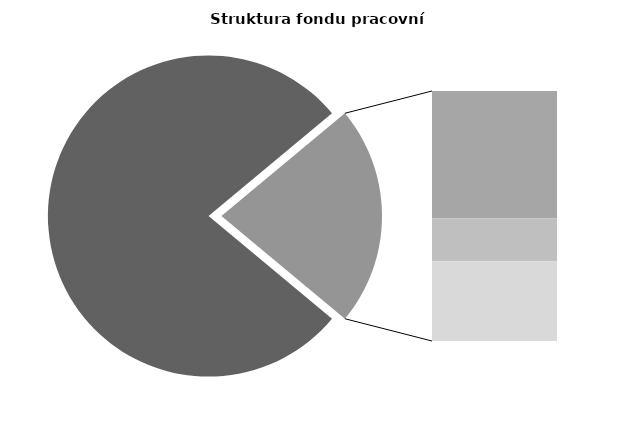
| Category | Series 0 |
|---|---|
| Průměrná měsíční odpracovaná doba bez přesčasu | 134.352 |
| Dovolená | 19.382 |
| Nemoc | 6.613 |
| Jiné | 12.106 |